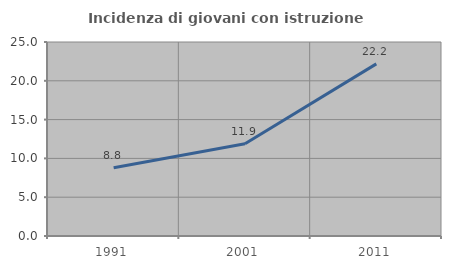
| Category | Incidenza di giovani con istruzione universitaria |
|---|---|
| 1991.0 | 8.791 |
| 2001.0 | 11.887 |
| 2011.0 | 22.184 |